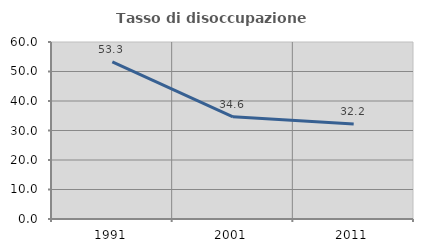
| Category | Tasso di disoccupazione giovanile  |
|---|---|
| 1991.0 | 53.301 |
| 2001.0 | 34.649 |
| 2011.0 | 32.219 |